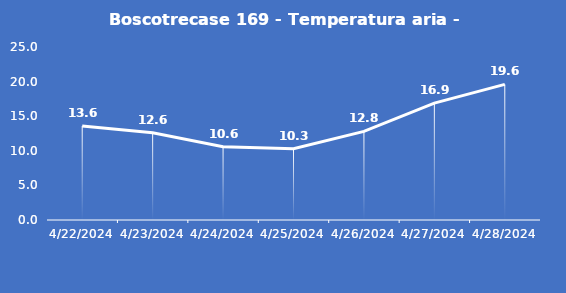
| Category | Boscotrecase 169 - Temperatura aria - Grezzo (°C) |
|---|---|
| 4/22/24 | 13.6 |
| 4/23/24 | 12.6 |
| 4/24/24 | 10.6 |
| 4/25/24 | 10.3 |
| 4/26/24 | 12.8 |
| 4/27/24 | 16.9 |
| 4/28/24 | 19.6 |